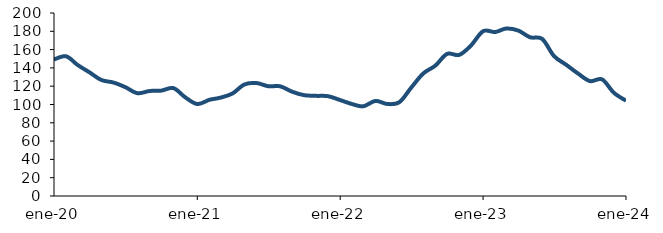
| Category | Series 0 |
|---|---|
| 2020-01-01 | 149.242 |
| 2020-02-01 | 152.669 |
| 2020-03-01 | 143.292 |
| 2020-04-01 | 135.035 |
| 2020-05-01 | 126.788 |
| 2020-06-01 | 124.002 |
| 2020-07-01 | 118.983 |
| 2020-08-01 | 112.386 |
| 2020-09-01 | 114.763 |
| 2020-10-01 | 115.159 |
| 2020-11-01 | 117.935 |
| 2020-12-01 | 107.927 |
| 2021-01-01 | 100.528 |
| 2021-02-01 | 105.144 |
| 2021-03-01 | 107.453 |
| 2021-04-01 | 112.047 |
| 2021-05-01 | 121.818 |
| 2021-06-01 | 123.47 |
| 2021-07-01 | 119.987 |
| 2021-08-01 | 119.848 |
| 2021-09-01 | 113.862 |
| 2021-10-01 | 110.18 |
| 2021-11-01 | 109.442 |
| 2021-12-01 | 109.08 |
| 2022-01-01 | 104.823 |
| 2022-02-01 | 100.399 |
| 2022-03-01 | 98.015 |
| 2022-04-01 | 103.921 |
| 2022-05-01 | 100.574 |
| 2022-06-01 | 102.532 |
| 2022-07-01 | 118.21 |
| 2022-08-01 | 133.857 |
| 2022-09-01 | 142.486 |
| 2022-10-01 | 155.309 |
| 2022-11-01 | 154.196 |
| 2022-12-01 | 164.427 |
| 2023-01-01 | 180.097 |
| 2023-02-01 | 179.205 |
| 2023-03-01 | 183.022 |
| 2023-04-01 | 180.781 |
| 2023-05-01 | 173.469 |
| 2023-06-01 | 171.618 |
| 2023-07-01 | 153.008 |
| 2023-08-01 | 143.474 |
| 2023-09-01 | 133.698 |
| 2023-10-01 | 125.58 |
| 2023-11-01 | 127.415 |
| 2023-12-01 | 112.828 |
| 2024-01-01 | 104.142 |